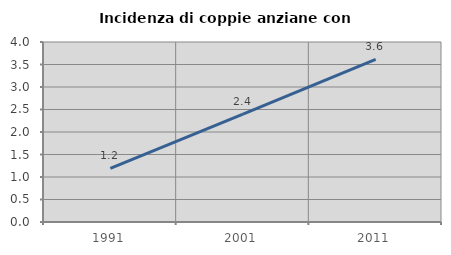
| Category | Incidenza di coppie anziane con figli |
|---|---|
| 1991.0 | 1.194 |
| 2001.0 | 2.397 |
| 2011.0 | 3.613 |